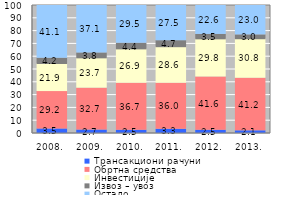
| Category | Трансакциони рачуни | Обртна средства | Инвестиције | Извоз – увоз | Остало |
|---|---|---|---|---|---|
| 2008. | 3.529 | 29.227 | 21.942 | 4.162 | 41.14 |
| 2009. | 2.681 | 32.731 | 23.696 | 3.826 | 37.066 |
| 2010. | 2.539 | 36.656 | 26.916 | 4.405 | 29.483 |
| 2011. | 3.264 | 35.966 | 28.585 | 4.727 | 27.458 |
| 2012. | 2.53 | 41.6 | 29.828 | 3.455 | 22.586 |
| 2013. | 2.064 | 41.16 | 30.811 | 2.994 | 22.972 |